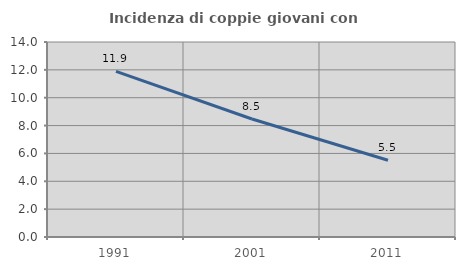
| Category | Incidenza di coppie giovani con figli |
|---|---|
| 1991.0 | 11.888 |
| 2001.0 | 8.471 |
| 2011.0 | 5.514 |